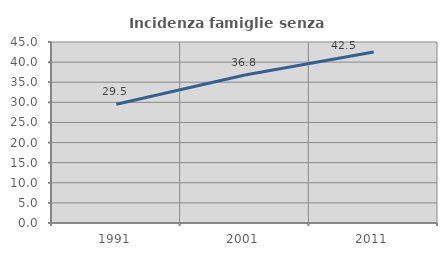
| Category | Incidenza famiglie senza nuclei |
|---|---|
| 1991.0 | 29.508 |
| 2001.0 | 36.803 |
| 2011.0 | 42.508 |